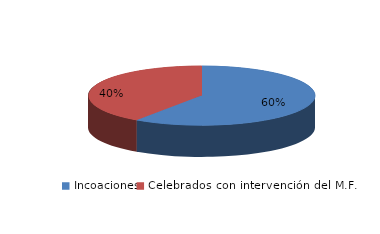
| Category | Series 0 |
|---|---|
| Incoaciones | 761 |
| Celebrados con intervención del M.F. | 515 |